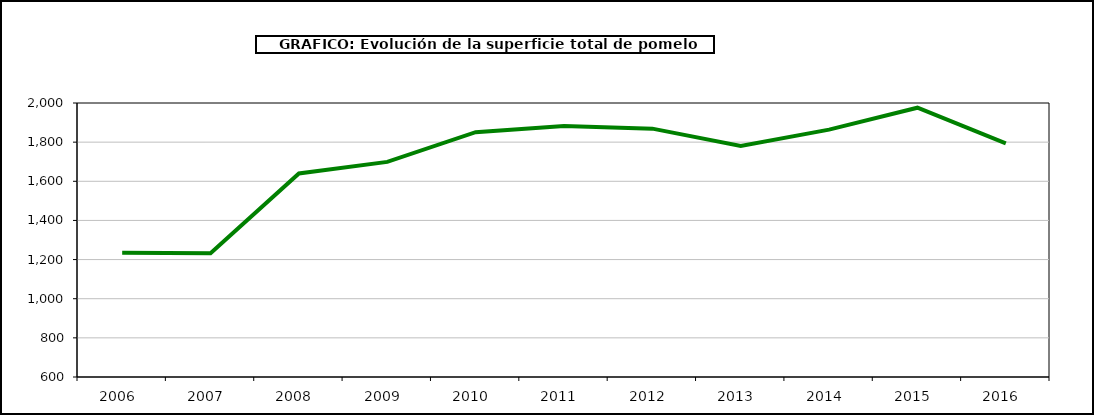
| Category | superficie |
|---|---|
| 2006.0 | 1235 |
| 2007.0 | 1232 |
| 2008.0 | 1640 |
| 2009.0 | 1699 |
| 2010.0 | 1851 |
| 2011.0 | 1882 |
| 2012.0 | 1869 |
| 2013.0 | 1781 |
| 2014.0 | 1864 |
| 2015.0 | 1976 |
| 2016.0 | 1794 |